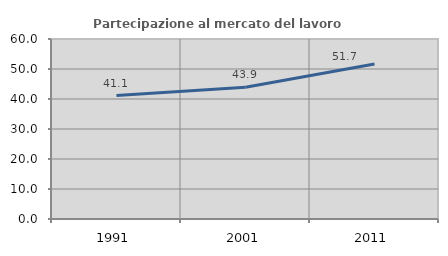
| Category | Partecipazione al mercato del lavoro  femminile |
|---|---|
| 1991.0 | 41.149 |
| 2001.0 | 43.889 |
| 2011.0 | 51.692 |